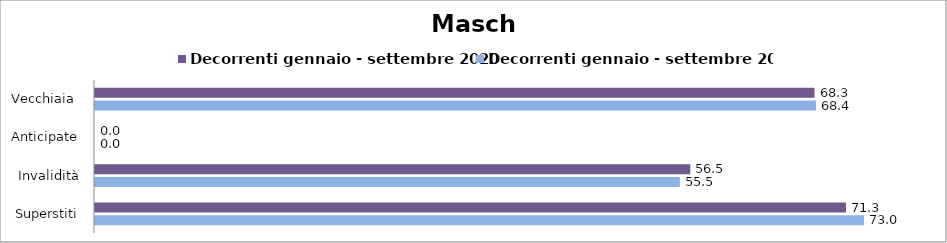
| Category | Decorrenti gennaio - settembre 2020 | Decorrenti gennaio - settembre 2021 |
|---|---|---|
| Vecchiaia  | 68.28 | 68.43 |
| Anticipate | 0 | 0 |
| Invalidità | 56.49 | 55.5 |
| Superstiti | 71.27 | 72.98 |